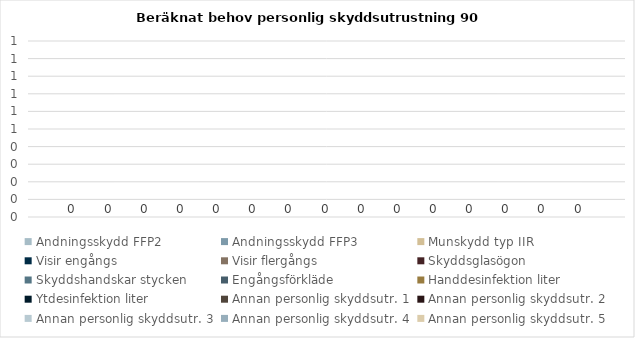
| Category | Andningsskydd FFP2 | Andningsskydd FFP3 | Munskydd typ IIR | Visir engångs | Visir flergångs | Skyddsglasögon | Skyddshandskar stycken | Engångsförkläde | Handdesinfektion liter | Ytdesinfektion liter | Annan personlig skyddsutr. 1 | Annan personlig skyddsutr. 2 | Annan personlig skyddsutr. 3 | Annan personlig skyddsutr. 4 | Annan personlig skyddsutr. 5 |
|---|---|---|---|---|---|---|---|---|---|---|---|---|---|---|---|
| Beräknat behov 90 dagar | 0 | 0 | 0 | 0 | 0 | 0 | 0 | 0 | 0 | 0 | 0 | 0 | 0 | 0 | 0 |